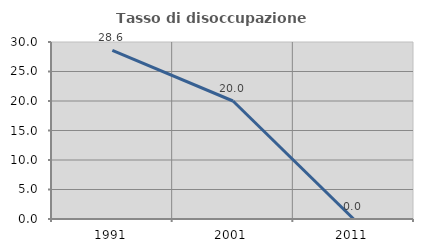
| Category | Tasso di disoccupazione giovanile  |
|---|---|
| 1991.0 | 28.571 |
| 2001.0 | 20 |
| 2011.0 | 0 |